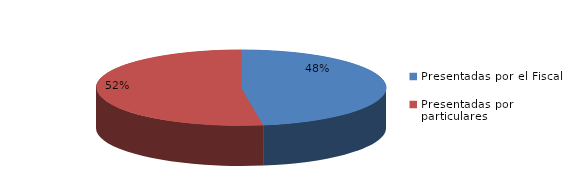
| Category | Series 0 |
|---|---|
| Presentadas por el Fiscal | 78 |
| Presentadas por particulares | 86 |